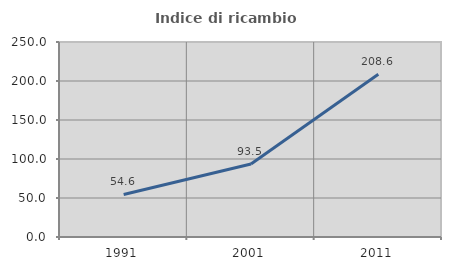
| Category | Indice di ricambio occupazionale  |
|---|---|
| 1991.0 | 54.577 |
| 2001.0 | 93.498 |
| 2011.0 | 208.563 |